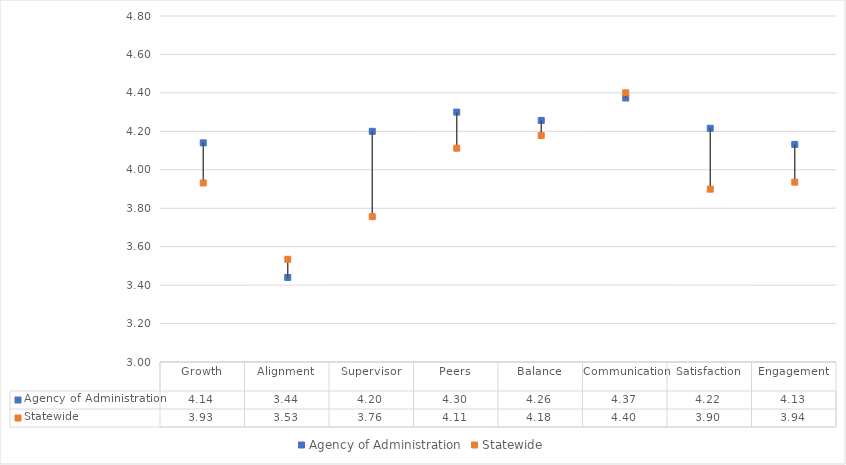
| Category | Agency of Administration | Statewide |
|---|---|---|
| Growth | 4.14 | 3.931 |
| Alignment | 3.44 | 3.534 |
| Supervisor | 4.2 | 3.756 |
| Peers | 4.3 | 4.112 |
| Balance | 4.257 | 4.178 |
| Communication | 4.373 | 4.4 |
| Satisfaction | 4.216 | 3.899 |
| Engagement | 4.132 | 3.936 |